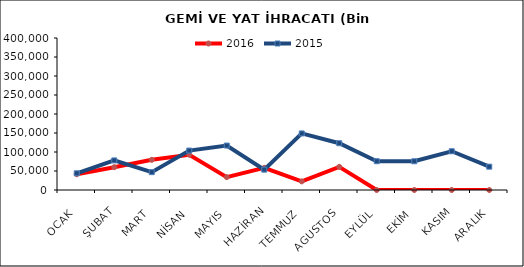
| Category | 2016 | 2015 |
|---|---|---|
| OCAK | 41417.512 | 43975.631 |
| ŞUBAT | 60080.299 | 77870.874 |
| MART | 79414.776 | 46982.887 |
| NİSAN | 92793.202 | 103764.36 |
| MAYIS | 33853.179 | 116960.594 |
| HAZİRAN | 58315.611 | 53593.841 |
| TEMMUZ | 22693.123 | 148860.655 |
| AGUSTOS | 60905.219 | 123107.683 |
| EYLÜL | 0 | 75751.284 |
| EKİM | 0 | 75632.592 |
| KASIM | 0 | 102000.234 |
| ARALIK | 0 | 61358.134 |